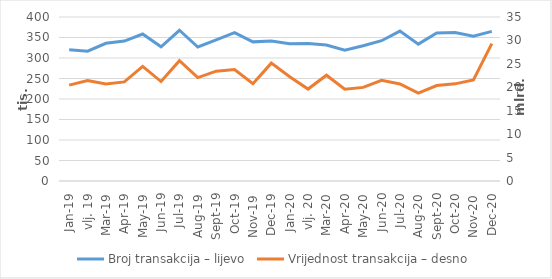
| Category | Broj transakcija – lijevo |
|---|---|
| sij.19 | 320078 |
| vlj. 19 | 316492 |
| ožu.19 | 335948 |
| tra.19 | 341258 |
| svi.19 | 358577 |
| lip.19 | 327234 |
| srp.19 | 367649 |
| kol.19 | 326772 |
| ruj.19 | 344040 |
| lis.19 | 361767 |
| stu.19 | 339353 |
| pro.19 | 341408 |
| sij.20 | 334778 |
| vlj. 20 | 335533 |
| ožu.20 | 331555 |
| tra.20 | 319128 |
| svi.20 | 329820 |
| lip.20 | 342182 |
| srp.20 | 365587 |
| kol.20 | 333814 |
| ruj.20 | 360919 |
| lis.20 | 362038 |
| stu.20 | 353021 |
| pro.20 | 364975 |